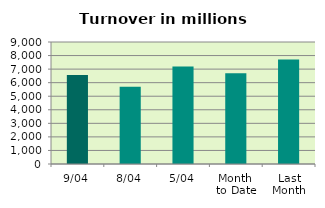
| Category | Series 0 |
|---|---|
| 9/04 | 6569.819 |
| 8/04 | 5691.533 |
| 5/04 | 7193.467 |
| Month 
to Date | 6699.63 |
| Last
Month | 7711.184 |